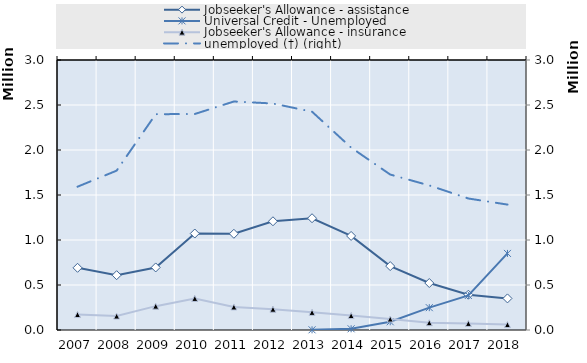
| Category | Jobseeker's Allowance - assistance | Universal Credit - Unemployed | Jobseeker's Allowance - insurance |
|---|---|---|---|
| 2007.0 | 691000 | 0 | 172000 |
| 2008.0 | 609000 | 0 | 155000 |
| 2009.0 | 695000 | 0 | 265000 |
| 2010.0 | 1072000 | 0 | 351000 |
| 2011.0 | 1069000 | 0 | 256000 |
| 2012.0 | 1208000 | 0 | 231000 |
| 2013.0 | 1242000 | 2219 | 196000 |
| 2014.0 | 1045000 | 13516 | 160000 |
| 2015.0 | 710000 | 91490 | 122000 |
| 2016.0 | 522000 | 248184 | 81000 |
| 2017.0 | 392000 | 383890 | 73000 |
| 2018.0 | 351000 | 851017 | 60000 |